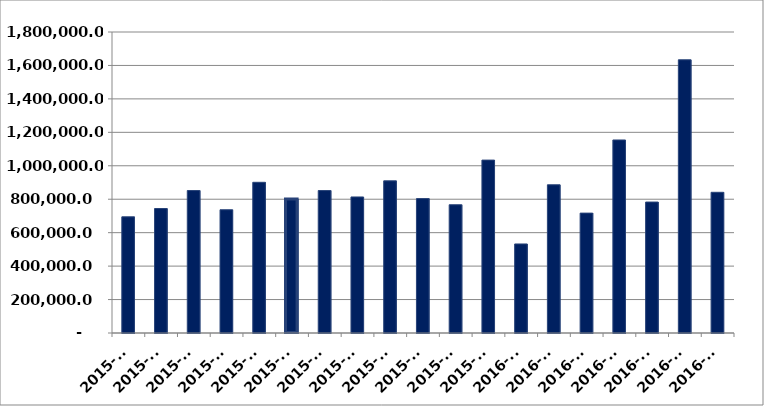
| Category | საქონლით საგარეო ვაჭრობა სულ ბრუნვა |
|---|---|
| 2015-01 | 694784.132 |
| 2015-02 | 744505.34 |
| 2015-03 | 851891.26 |
| 2015-04 | 736985.435 |
| 2015-05 | 901178.115 |
| 2015-06 | 801638.813 |
| 2015-07 | 851802.767 |
| 2015-08 | 813479.004 |
| 2015-09 | 909959.451 |
| 2015-10 | 803725.951 |
| 2015-11 | 766938.991 |
| 2015-12 | 1033937.049 |
| 2016-01 | 532449.629 |
| 2016-02 | 886278.961 |
| 2016-03 | 716890.228 |
| 2016-04 | 1154317.239 |
| 2016-05 | 783071.145 |
| 2016-06 | 1633706.354 |
| 2016-07 | 841338.499 |